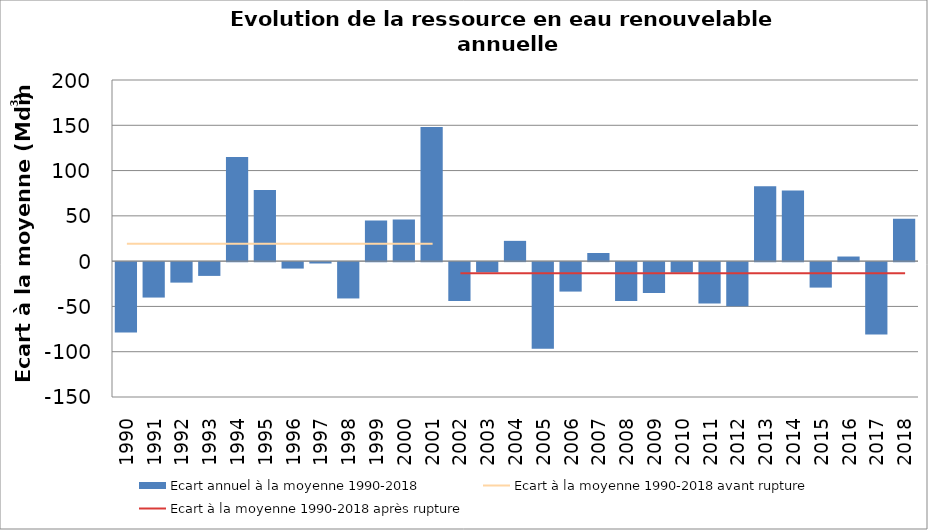
| Category | Ecart annuel à la moyenne 1990-2018 |
|---|---|
| 1990.0 | -77.8 |
| 1991.0 | -39.1 |
| 1992.0 | -22.6 |
| 1993.0 | -15.2 |
| 1994.0 | 115.1 |
| 1995.0 | 78.6 |
| 1996.0 | -7.1 |
| 1997.0 | -1.5 |
| 1998.0 | -40.1 |
| 1999.0 | 44.9 |
| 2000.0 | 46.1 |
| 2001.0 | 148.2 |
| 2002.0 | -42.9 |
| 2003.0 | -11.3 |
| 2004.0 | 22.4 |
| 2005.0 | -95.6 |
| 2006.0 | -32.5 |
| 2007.0 | 9 |
| 2008.0 | -42.9 |
| 2009.0 | -34.1 |
| 2010.0 | -11.6 |
| 2011.0 | -45.8 |
| 2012.0 | -48.7 |
| 2013.0 | 82.6 |
| 2014.0 | 78.1 |
| 2015.0 | -28.1 |
| 2016.0 | 5.1 |
| 2017.0 | -80 |
| 2018.0 | 46.8 |